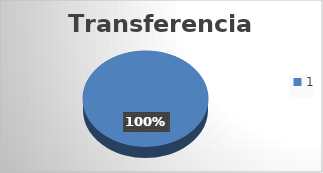
| Category | Transferencias: |
|---|---|
| 0 | 1 |